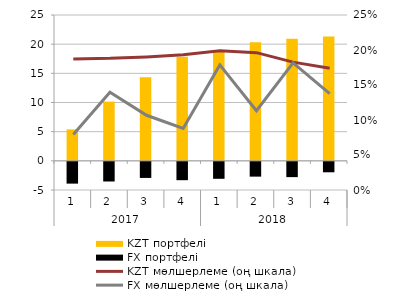
| Category | KZT портфелі | FX портфелі |
|---|---|---|
| 0 | 5.385 | -3.734 |
| 1 | 10.15 | -3.369 |
| 2 | 14.33 | -2.759 |
| 3 | 17.853 | -3.148 |
| 4 | 18.93 | -2.909 |
| 5 | 20.347 | -2.536 |
| 6 | 20.921 | -2.62 |
| 7 | 21.331 | -1.792 |